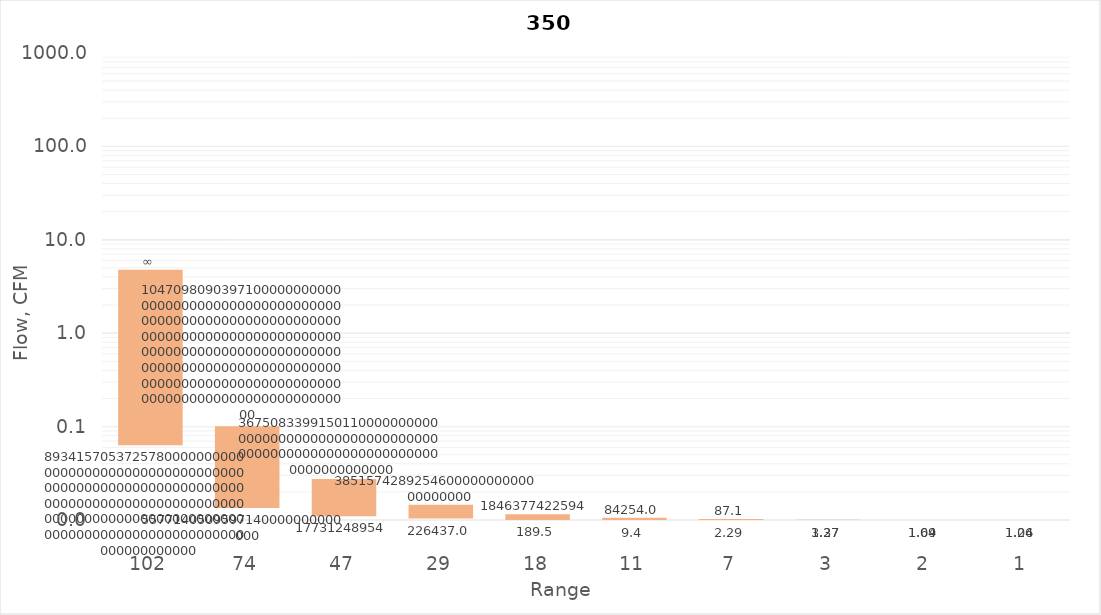
| Category | min Flow, CFM | delta | max Flow, CFM |
|---|---|---|---|
| 102.0 | 161.951 | 373.924 | 535.875 |
| 74.0 | 27.746 | 173.274 | 201.02 |
| 47.0 | 10.249 | 77.317 | 87.565 |
| 29.0 | 5.355 | 27.231 | 32.586 |
| 18.0 | 2.278 | 9.989 | 12.266 |
| 11.0 | 0.975 | 3.95 | 4.926 |
| 7.0 | 0.359 | 1.581 | 1.94 |
| 3.0 | 0.103 | 0.424 | 0.527 |
| 2.0 | 0.036 | 0.178 | 0.214 |
| 1.0 | 0.018 | 0.083 | 0.102 |